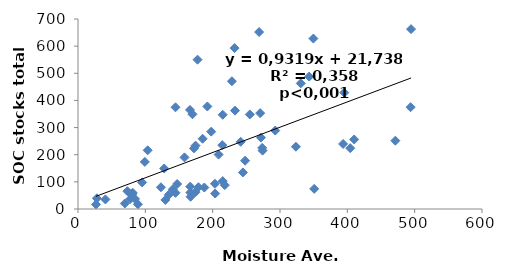
| Category | C_total |
|---|---|
| 214.9475 | 102.815 |
| 494.655 | 662.671 |
| 292.9025 | 288.947 |
| 233.20833333333334 | 362.455 |
| 410.17 | 256.288 |
| 471.3 | 251.709 |
| 330.83799999999997 | 462.897 |
| 350.77 | 74.214 |
| 192.09666666666666 | 377.819 |
| 228.60833333333335 | 470.715 |
| 123.18 | 79.973 |
| 241.602 | 247.699 |
| 174.43 | 62.035 |
| 269.0075 | 651.921 |
| 84.72 | 37.113 |
| 203.428 | 93.084 |
| 167.13 | 45.168 |
| 187.615 | 79.079 |
| 129.785 | 33.313 |
| 232.546 | 592.914 |
| 404.2725 | 224.095 |
| 178.89 | 80.297 |
| 166.87 | 60.733 |
| 158.12714285714284 | 190.189 |
| 89.03 | 17.528 |
| 147.25 | 92.069 |
| 99.28333333333332 | 173.554 |
| 80.41 | 56.097 |
| 128.015 | 149.285 |
| 103.45750000000001 | 216.118 |
| 177.54833333333332 | 550.08 |
| 395.46400000000006 | 428.618 |
| 28.05 | 39.318 |
| 144.83 | 59.683 |
| 95.23 | 97.969 |
| 166.33166666666668 | 364.905 |
| 255.16000000000003 | 348.337 |
| 80.04 | 53.682 |
| 144.82 | 374.794 |
| 197.872 | 284.982 |
| 69.56 | 20.421 |
| 40.73 | 35.267 |
| 166.745 | 82.651 |
| 271.69 | 262.961 |
| 214.28400000000002 | 235.38 |
| 248.13285714285715 | 178.005 |
| 134.85 | 52.242 |
| 273.51666666666665 | 225.178 |
| 218.055 | 87.964 |
| 203.74 | 56.941 |
| 349.5716666666667 | 627.933 |
| 393.738 | 239.658 |
| 81.2225 | 59.839 |
| 73.37 | 65.646 |
| 185.1225 | 258.838 |
| 244.91166666666672 | 134.735 |
| 214.95473684210526 | 347.236 |
| 170.02833333333334 | 349.039 |
| 172.20999999999998 | 223.453 |
| 208.82000000000002 | 200.402 |
| 140.755 | 72.403 |
| 77.485 | 36.592 |
| 26.73 | 16.724 |
| 493.9273088809132 | 375.112 |
| 343.3104768551357 | 487.774 |
| 270.5220384277066 | 353.125 |
| 174.63392912402793 | 233.469 |
| 323.64370049733316 | 229.423 |
| 274.15787699701417 | 215.148 |